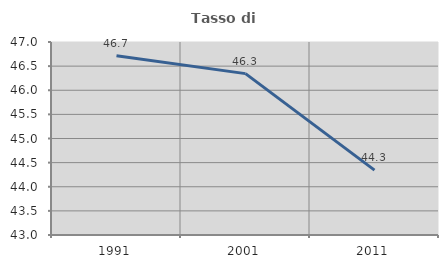
| Category | Tasso di occupazione   |
|---|---|
| 1991.0 | 46.713 |
| 2001.0 | 46.344 |
| 2011.0 | 44.344 |